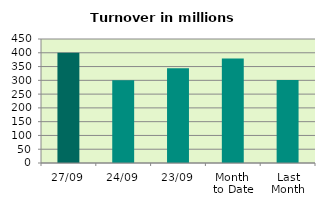
| Category | Series 0 |
|---|---|
| 27/09 | 400.203 |
| 24/09 | 299.945 |
| 23/09 | 343.696 |
| Month 
to Date | 379.219 |
| Last
Month | 300.77 |